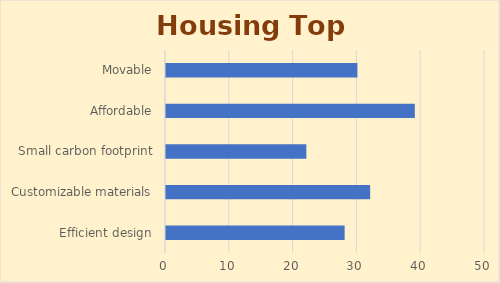
| Category | Series 0 |
|---|---|
| Efficient design | 28 |
| Customizable materials | 32 |
| Small carbon footprint | 22 |
| Affordable | 39 |
| Movable | 30 |